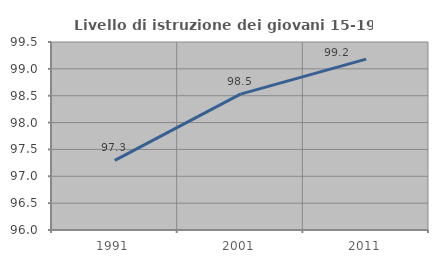
| Category | Livello di istruzione dei giovani 15-19 anni |
|---|---|
| 1991.0 | 97.297 |
| 2001.0 | 98.529 |
| 2011.0 | 99.18 |